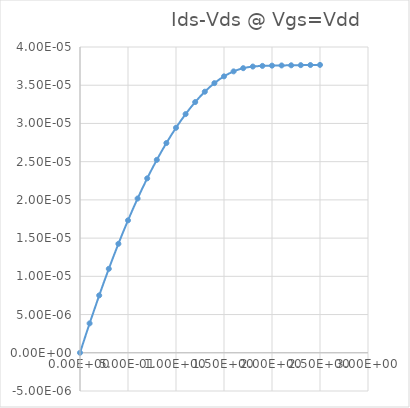
| Category | Series 0 |
|---|---|
| 0.0 | 0 |
| 0.1 | 0 |
| 0.2 | 0 |
| 0.3 | 0 |
| 0.4 | 0 |
| 0.5 | 0 |
| 0.6 | 0 |
| 0.7 | 0 |
| 0.8 | 0 |
| 0.9 | 0 |
| 1.0 | 0 |
| 1.1 | 0 |
| 1.2 | 0 |
| 1.3 | 0 |
| 1.4 | 0 |
| 1.5 | 0 |
| 1.6 | 0 |
| 1.7 | 0 |
| 1.8 | 0 |
| 1.9 | 0 |
| 2.0 | 0 |
| 2.1 | 0 |
| 2.2 | 0 |
| 2.3 | 0 |
| 2.4 | 0 |
| 2.5 | 0 |